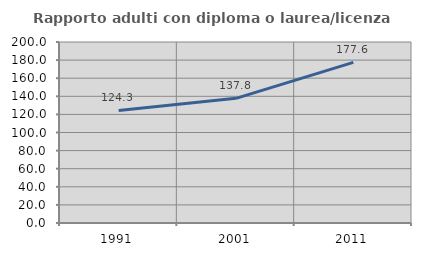
| Category | Rapporto adulti con diploma o laurea/licenza media  |
|---|---|
| 1991.0 | 124.324 |
| 2001.0 | 137.778 |
| 2011.0 | 177.551 |